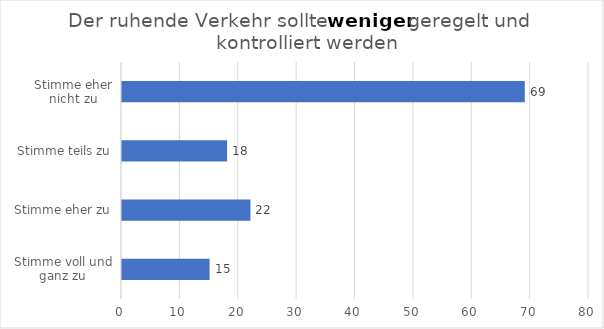
| Category | Series 0 |
|---|---|
| Stimme voll und ganz zu | 15 |
| Stimme eher zu | 22 |
| Stimme teils zu | 18 |
| Stimme eher nicht zu | 69 |